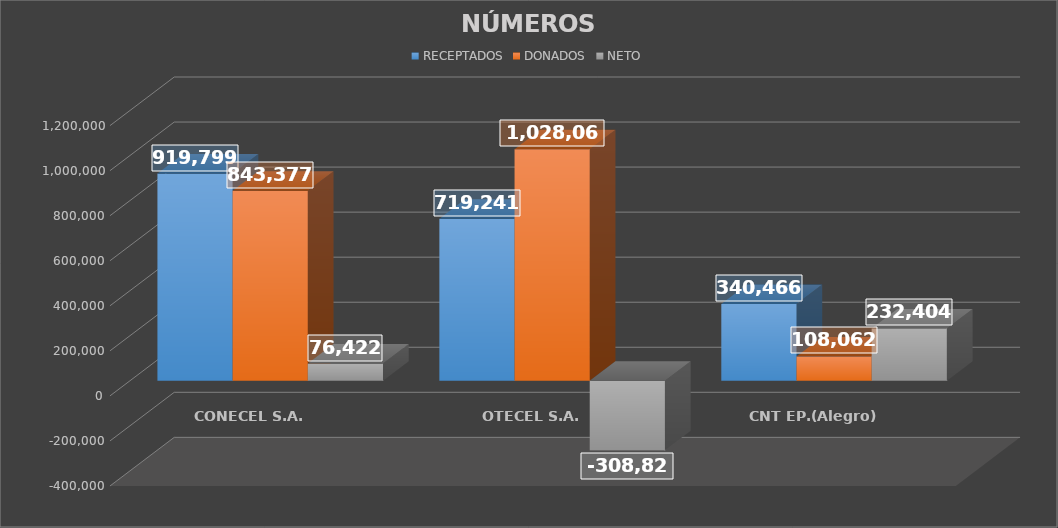
| Category | RECEPTADOS | DONADOS | NETO |
|---|---|---|---|
| CONECEL S.A. | 919799 | 843377 | 76422 |
| OTECEL S.A. | 719241 | 1028067 | -308826 |
| CNT EP.(Alegro) | 340466 | 108062 | 232404 |